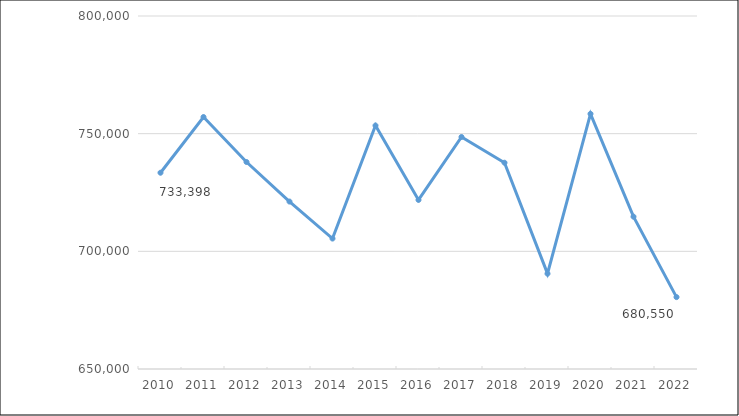
| Category | Ensemble espèce porcine |
|---|---|
| 2010.0 | 733398 |
| 2011.0 | 757070 |
| 2012.0 | 737960 |
| 2013.0 | 721150 |
| 2014.0 | 705430 |
| 2015.0 | 753460 |
| 2016.0 | 721850 |
| 2017.0 | 748590 |
| 2018.0 | 737650 |
| 2019.0 | 690510 |
| 2020.0 | 758427 |
| 2021.0 | 714729 |
| 2022.0 | 680550 |